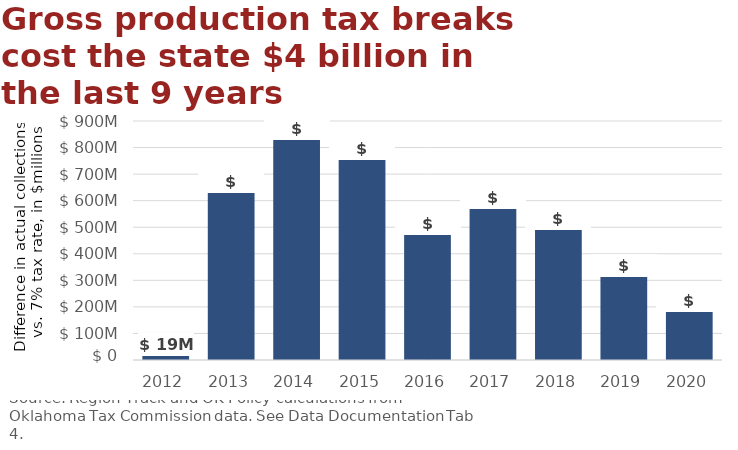
| Category | Series 0 |
|---|---|
| 0 | 19037675.41 |
| 1 | 634023407 |
| 2 | 833422421.71 |
| 3 | 755657017.1 |
| 4 | 475288021.52 |
| 5 | 573162622.75 |
| 6 | 493646673.368 |
| 7 | 314807571 |
| 8 | 183021759.474 |